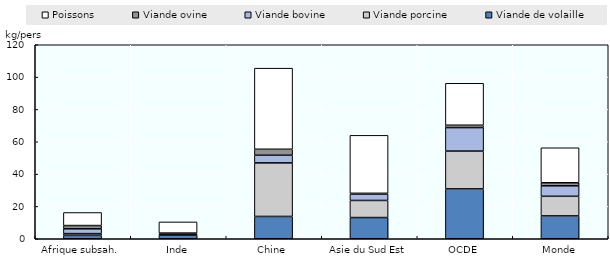
| Category | Viande de volaille | Viande porcine | Viande bovine | Viande ovine | Poissons |
|---|---|---|---|---|---|
| Afrique subsah. | 2.117 | 1.059 | 2.986 | 1.997 | 8.083 |
| Inde | 2.302 | 0.238 | 0.529 | 0.444 | 6.899 |
| Chine | 13.805 | 33.148 | 4.717 | 3.683 | 50.161 |
| Asie du Sud Est | 13.124 | 10.566 | 3.952 | 0.462 | 35.863 |
| OCDE | 30.846 | 23.39 | 14.528 | 1.459 | 25.949 |
| Monde | 14.131 | 12.136 | 6.495 | 1.881 | 21.641 |